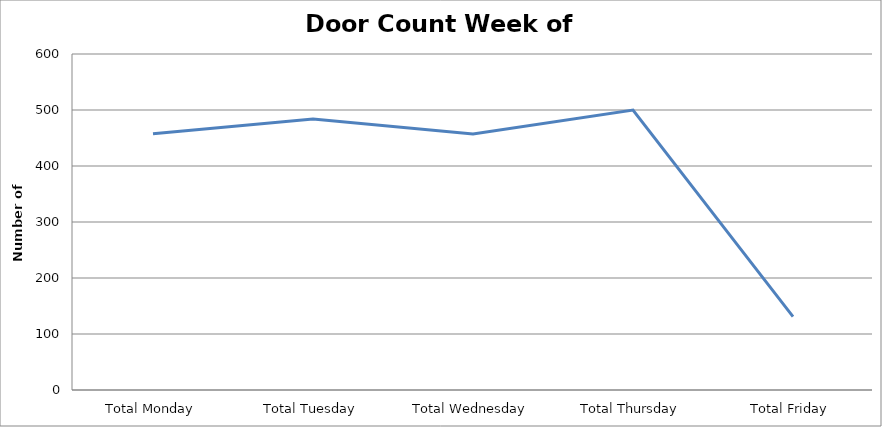
| Category | Series 0 |
|---|---|
| Total Monday | 457.5 |
| Total Tuesday | 484 |
| Total Wednesday | 457 |
| Total Thursday | 500 |
| Total Friday | 131 |